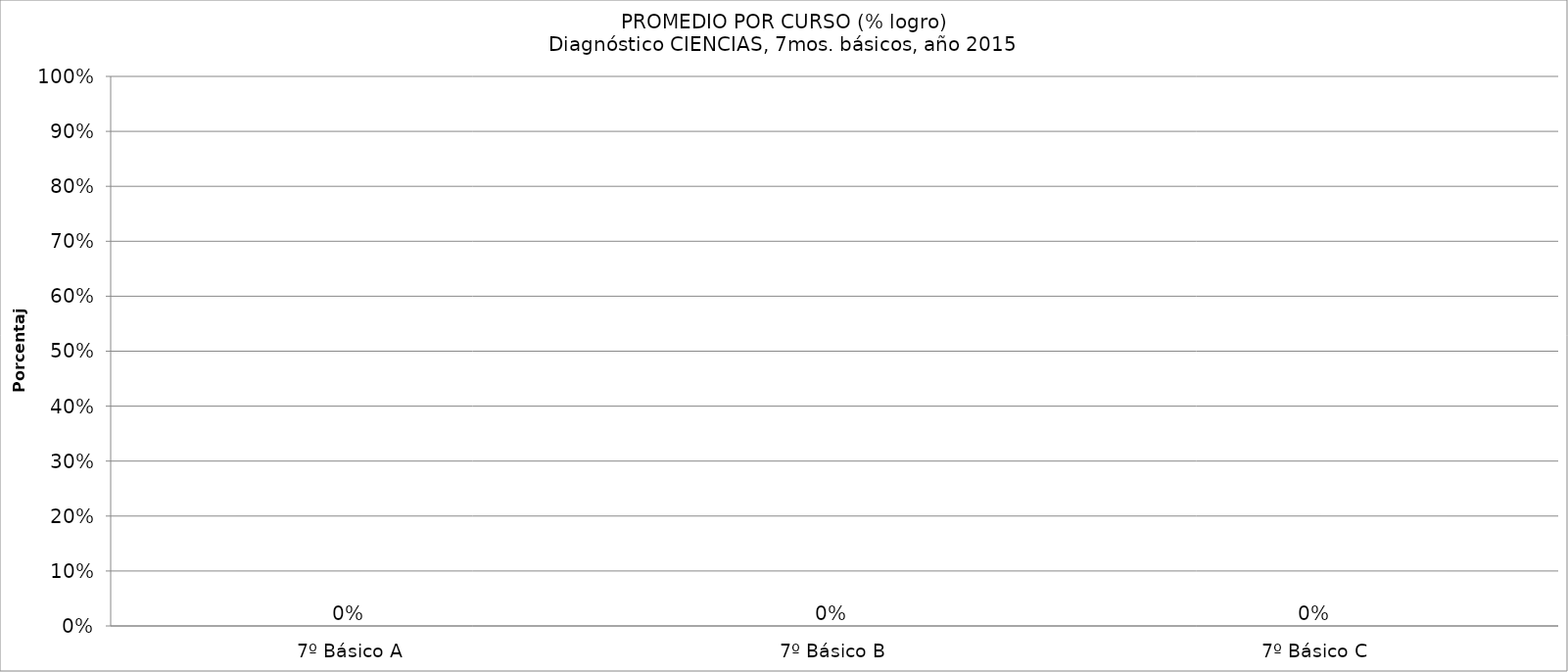
| Category | Series 0 |
|---|---|
| 7º Básico A | 0 |
| 7º Básico B | 0 |
| 7º Básico C | 0 |